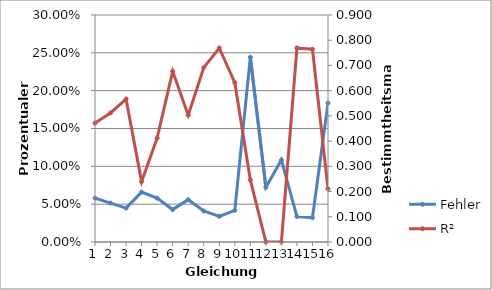
| Category | Fehler |
|---|---|
| 1.0 | 0.058 |
| 2.0 | 0.051 |
| 3.0 | 0.045 |
| 4.0 | 0.066 |
| 5.0 | 0.058 |
| 6.0 | 0.043 |
| 7.0 | 0.056 |
| 8.0 | 0.041 |
| 9.0 | 0.034 |
| 10.0 | 0.042 |
| 11.0 | 0.244 |
| 12.0 | 0.072 |
| 13.0 | 0.108 |
| 14.0 | 0.034 |
| 15.0 | 0.032 |
| 16.0 | 0.184 |